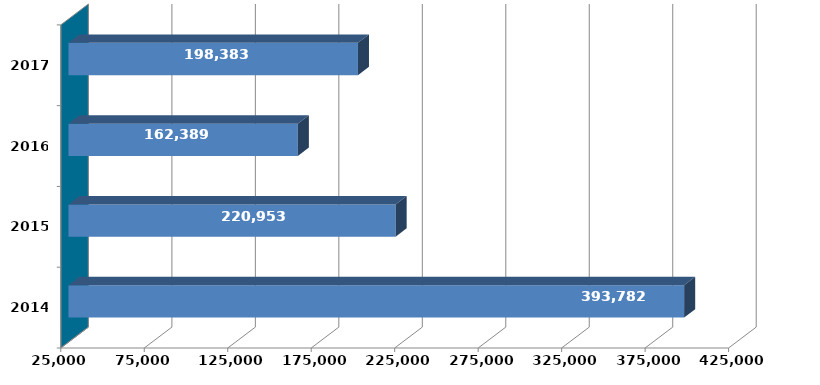
| Category | Column2 |
|---|---|
| 2014.0 | 393782069 |
| 2015.0 | 220952703 |
| 2016.0 | 162388931 |
| 2017.0 | 198382761 |